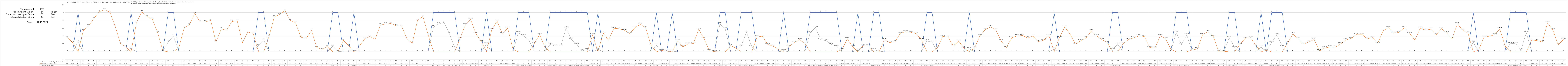
| Category | 1 = Strom reicht im Tagesdurchschnitt aus | Zusätzlich benötigter Strom | Überschüssiger Strom |
|---|---|---|---|
| 0 | 0 | 0.36 | 0 |
| 1 | 0 | 0.23 | 0 |
| 2 | 1 | 0 | 0.25 |
| 3 | 0 | 0.54 | 0 |
| 4 | 0 | 0.66 | 0 |
| 5 | 0 | 0.85 | 0 |
| 6 | 0 | 1.02 | 0 |
| 7 | 0 | 1.07 | 0 |
| 8 | 0 | 1.01 | 0 |
| 9 | 0 | 0.65 | 0 |
| 10 | 0 | 0.21 | 0 |
| 11 | 0 | 0.12 | 0 |
| 12 | 1 | 0 | 0.09 |
| 13 | 0 | 0.73 | 0 |
| 14 | 0 | 1.02 | 0 |
| 15 | 0 | 0.9 | 0 |
| 16 | 0 | 0.83 | 0 |
| 17 | 0 | 0.49 | 0 |
| 18 | 0 | 0.02 | 0 |
| 19 | 1 | 0 | 0.25 |
| 20 | 1 | 0 | 0.4 |
| 21 | 0 | 0.1 | 0 |
| 22 | 0 | 0.61 | 0 |
| 23 | 0 | 0.69 | 0 |
| 24 | 0 | 0.98 | 0 |
| 25 | 0 | 0.76 | 0 |
| 26 | 0 | 0.76 | 0 |
| 27 | 0 | 0.8 | 0 |
| 28 | 0 | 0.25 | 0 |
| 29 | 0 | 0.58 | 0 |
| 30 | 0 | 0.55 | 0 |
| 31 | 0 | 0.77 | 0 |
| 32 | 0 | 0.79 | 0 |
| 33 | 0 | 0.23 | 0 |
| 34 | 0 | 0.5 | 0 |
| 35 | 0 | 0.47 | 0 |
| 36 | 1 | 0 | 0.16 |
| 37 | 1 | 0 | 0.3 |
| 38 | 0 | 0.39 | 0 |
| 39 | 0 | 0.89 | 0 |
| 40 | 0 | 0.95 | 0 |
| 41 | 0 | 1.05 | 0 |
| 42 | 0 | 0.8 | 0 |
| 43 | 0 | 0.74 | 0 |
| 44 | 0 | 0.37 | 0 |
| 45 | 0 | 0.34 | 0 |
| 46 | 0 | 0.54 | 0 |
| 47 | 0 | 0.11 | 0 |
| 48 | 0 | 0.06 | 0 |
| 49 | 0 | 0.13 | 0 |
| 50 | 1 | 0 | 0.14 |
| 51 | 1 | 0 | 0.01 |
| 52 | 0 | 0.29 | 0 |
| 53 | 0 | 0.16 | 0 |
| 54 | 1 | 0 | 0 |
| 55 | 0 | 0.14 | 0 |
| 56 | 0 | 0.32 | 0 |
| 57 | 0 | 0.39 | 0 |
| 58 | 0 | 0.32 | 0 |
| 59 | 0 | 0.68 | 0 |
| 60 | 0 | 0.71 | 0 |
| 61 | 0 | 0.72 | 0 |
| 62 | 0 | 0.66 | 0 |
| 63 | 0 | 0.65 | 0 |
| 64 | 0 | 0.33 | 0 |
| 65 | 0 | 0.22 | 0 |
| 66 | 0 | 0.8 | 0 |
| 67 | 0 | 0.9 | 0 |
| 68 | 0 | 0.43 | 0 |
| 69 | 1 | 0 | 0.63 |
| 70 | 1 | 0 | 0.71 |
| 71 | 1 | 0 | 0.75 |
| 72 | 1 | 0 | 0.46 |
| 73 | 1 | 0 | 0.11 |
| 74 | 0 | 0.335 | 0 |
| 75 | 0 | 0.683 | 0 |
| 76 | 0 | 0.822 | 0 |
| 77 | 0 | 0.459 | 0 |
| 78 | 0 | 0.265 | 0 |
| 79 | 1 | 0 | 0.195 |
| 80 | 0 | 0.568 | 0 |
| 81 | 0 | 0.78 | 0 |
| 82 | 0 | 0.454 | 0 |
| 83 | 0 | 0.6 | 0 |
| 84 | 0 | 0.055 | 0 |
| 85 | 1 | 0 | 0.484 |
| 86 | 1 | 0 | 0.402 |
| 87 | 1 | 0 | 0.297 |
| 88 | 0 | 0.206 | 0 |
| 89 | 0 | 0.437 | 0 |
| 90 | 0 | 0.115 | 0 |
| 91 | 1 | 0 | 0.189 |
| 92 | 1 | 0 | 0.142 |
| 93 | 1 | 0 | 0.144 |
| 94 | 1 | 0 | 0.606 |
| 95 | 1 | 0 | 0.315 |
| 96 | 1 | 0 | 0.189 |
| 97 | 1 | 0 | 0.021 |
| 98 | 1 | 0 | 0.059 |
| 99 | 0 | 0.428 | 0 |
| 100 | 1 | 0 | 0.063 |
| 101 | 0 | 0.473 | 0 |
| 102 | 0 | 0.298 | 0 |
| 103 | 0 | 0.597 | 0 |
| 104 | 0 | 0.587 | 0 |
| 105 | 0 | 0.546 | 0 |
| 106 | 0 | 0.465 | 0 |
| 107 | 0 | 0.616 | 0 |
| 108 | 0 | 0.701 | 0 |
| 109 | 0 | 0.61 | 0 |
| 110 | 0 | 0.166 | 0 |
| 111 | 1 | 0 | 0.17 |
| 112 | 0 | 0.034 | 0 |
| 113 | 0 | 0.014 | 0 |
| 114 | 1 | 0 | 0.016 |
| 115 | 0 | 0.277 | 0 |
| 116 | 0 | 0.123 | 0 |
| 117 | 0 | 0.2 | 0 |
| 118 | 0 | 0.21 | 0 |
| 119 | 0 | 0.573 | 0 |
| 120 | 0 | 0.335 | 0 |
| 121 | 0 | 0.028 | 0 |
| 122 | 0 | 0.003 | 0 |
| 123 | 1 | 0 | 0.71 |
| 124 | 1 | 0 | 0.582 |
| 125 | 0 | 0.155 | 0 |
| 126 | 0 | 0.092 | 0 |
| 127 | 1 | 0 | 0.142 |
| 128 | 1 | 0 | 0.5 |
| 129 | 1 | 0 | 0.131 |
| 130 | 0 | 0.379 | 0 |
| 131 | 0 | 0.395 | 0 |
| 132 | 0 | 0.188 | 0 |
| 133 | 0 | 0.143 | 0 |
| 134 | 0 | 0.064 | 0 |
| 135 | 1 | 0 | 0.021 |
| 136 | 0 | 0.129 | 0 |
| 137 | 0 | 0.236 | 0 |
| 138 | 0 | 0.309 | 0 |
| 139 | 0 | 0.217 | 0 |
| 140 | 1 | 0 | 0.482 |
| 141 | 1 | 0 | 0.617 |
| 142 | 1 | 0 | 0.307 |
| 143 | 1 | 0 | 0.283 |
| 144 | 1 | 0 | 0.189 |
| 145 | 1 | 0 | 0.138 |
| 146 | 0 | 0.052 | 0 |
| 147 | 0 | 0.329 | 0 |
| 148 | 0 | 0.128 | 0 |
| 149 | 1 | 0 | 0.035 |
| 150 | 0 | 0.156 | 0 |
| 151 | 0 | 0.146 | 0 |
| 152 | 1 | 0 | 0.05 |
| 153 | 1 | 0 | 0.014 |
| 154 | 0 | 0.307 | 0 |
| 155 | 0 | 0.234 | 0 |
| 156 | 0 | 0.255 | 0 |
| 157 | 0 | 0.469 | 0 |
| 158 | 0 | 0.512 | 0 |
| 159 | 0 | 0.495 | 0 |
| 160 | 0 | 0.461 | 0 |
| 161 | 0 | 0.3 | 0 |
| 162 | 1 | 0 | 0.274 |
| 163 | 1 | 0 | 0.243 |
| 164 | 0 | 0.101 | 0 |
| 165 | 0 | 0.393 | 0 |
| 166 | 0 | 0.369 | 0 |
| 167 | 0 | 0.144 | 0 |
| 168 | 0 | 0.27 | 0 |
| 169 | 0 | 0.095 | 0 |
| 170 | 1 | 0 | 0.077 |
| 171 | 0 | 0.095 | 0 |
| 172 | 0 | 0.406 | 0 |
| 173 | 0 | 0.563 | 0 |
| 174 | 0 | 0.63 | 0 |
| 175 | 0 | 0.556 | 0 |
| 176 | 0 | 0.273 | 0 |
| 177 | 0 | 0.11 | 0 |
| 178 | 0 | 0.355 | 0 |
| 179 | 0 | 0.403 | 0 |
| 180 | 0 | 0.415 | 0 |
| 181 | 0 | 0.351 | 0 |
| 182 | 0 | 0.399 | 0 |
| 183 | 0 | 0.258 | 0 |
| 184 | 0 | 0.293 | 0 |
| 185 | 0 | 0.408 | 0 |
| 186 | 1 | 0 | 0.065 |
| 187 | 0 | 0.367 | 0 |
| 188 | 0 | 0.629 | 0 |
| 189 | 0 | 0.448 | 0 |
| 190 | 0 | 0.191 | 0 |
| 191 | 0 | 0.281 | 0 |
| 192 | 0 | 0.35 | 0 |
| 193 | 0 | 0.528 | 0 |
| 194 | 0 | 0.402 | 0 |
| 195 | 0 | 0.31 | 0 |
| 196 | 0 | 0.235 | 0 |
| 197 | 1 | 0 | 0.063 |
| 198 | 1 | 0 | 0.187 |
| 199 | 0 | 0.206 | 0 |
| 200 | 0 | 0.309 | 0 |
| 201 | 0 | 0.354 | 0 |
| 202 | 0 | 0.404 | 0 |
| 203 | 0 | 0.388 | 0 |
| 204 | 0 | 0.11 | 0 |
| 205 | 0 | 0.093 | 0 |
| 206 | 0 | 0.41 | 0 |
| 207 | 0 | 0.329 | 0 |
| 208 | 0 | 0.066 | 0 |
| 209 | 1 | 0 | 0.493 |
| 210 | 1 | 0 | 0.182 |
| 211 | 1 | 0 | 0.433 |
| 212 | 0 | 0.042 | 0 |
| 213 | 0 | 0.071 | 0 |
| 214 | 0 | 0.441 | 0 |
| 215 | 0 | 0.51 | 0 |
| 216 | 0 | 0.389 | 0 |
| 217 | 0 | 0.012 | 0 |
| 218 | 0 | 0.011 | 0 |
| 219 | 1 | 0 | 0.358 |
| 220 | 1 | 0 | 0.112 |
| 221 | 0 | 0.184 | 0 |
| 222 | 0 | 0.34 | 0 |
| 223 | 0 | 0.36 | 0 |
| 224 | 0 | 0.168 | 0 |
| 225 | 1 | 0 | 0.116 |
| 226 | 0 | 0.036 | 0 |
| 227 | 1 | 0 | 0.242 |
| 228 | 1 | 0 | 0.43 |
| 229 | 1 | 0 | 0.129 |
| 230 | 0 | 0.223 | 0 |
| 231 | 0 | 0.451 | 0 |
| 232 | 0 | 0.331 | 0 |
| 233 | 0 | 0.194 | 0 |
| 234 | 0 | 0.249 | 0 |
| 235 | 0 | 0.314 | 0 |
| 236 | 0 | 0.019 | 0 |
| 237 | 0 | 0.095 | 0 |
| 238 | 0 | 0.122 | 0 |
| 239 | 0 | 0.118 | 0 |
| 240 | 0 | 0.198 | 0 |
| 241 | 0 | 0.302 | 0 |
| 242 | 0 | 0.341 | 0 |
| 243 | 0 | 0.444 | 0 |
| 244 | 0 | 0.445 | 0 |
| 245 | 0 | 0.329 | 0 |
| 246 | 0 | 0.361 | 0 |
| 247 | 0 | 0.216 | 0 |
| 248 | 0 | 0.534 | 0 |
| 249 | 0 | 0.615 | 0 |
| 250 | 0 | 0.472 | 0 |
| 251 | 0 | 0.495 | 0 |
| 252 | 0 | 0.613 | 0 |
| 253 | 0 | 0.47 | 0 |
| 254 | 0 | 0.296 | 0 |
| 255 | 0 | 0.6 | 0 |
| 256 | 0 | 0.55 | 0 |
| 257 | 0 | 0.576 | 0 |
| 258 | 0 | 0.432 | 0 |
| 259 | 0 | 0.59 | 0 |
| 260 | 0 | 0.477 | 0 |
| 261 | 0 | 0.331 | 0 |
| 262 | 0 | 0.714 | 0 |
| 263 | 0 | 0.548 | 0 |
| 264 | 0 | 0.476 | 0 |
| 265 | 1 | 0 | 0.242 |
| 266 | 0 | 0.041 | 0 |
| 267 | 0 | 0.369 | 0 |
| 268 | 0 | 0.396 | 0 |
| 269 | 0 | 0.43 | 0 |
| 270 | 0 | 0.579 | 0 |
| 271 | 0 | 0.143 | 0 |
| 272 | 1 | 0 | 0.215 |
| 273 | 1 | 0 | 0.205 |
| 274 | 1 | 0 | 0.042 |
| 275 | 1 | 0 | 0.487 |
| 276 | 0 | 0.297 | 0 |
| 277 | 0 | 0.287 | 0 |
| 278 | 0 | 0.249 | 0 |
| 279 | 0 | 0.736 | 0 |
| 280 | 0 | 0.554 | 0 |
| 281 | 0 | 0.174 | 0 |
| 282 | 0 | 0.313 | 0 |